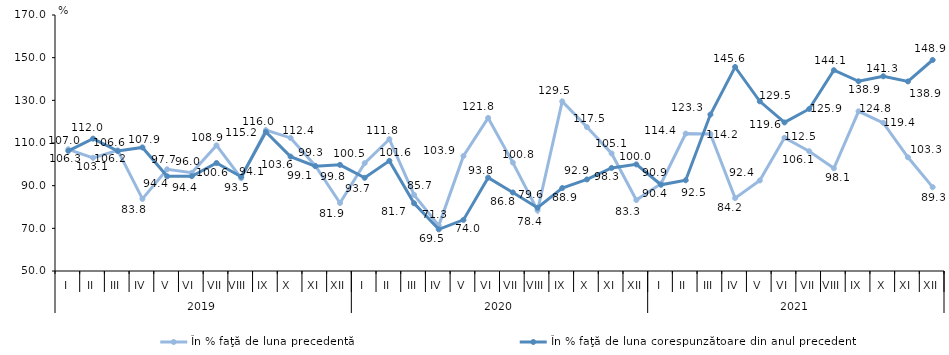
| Category | În % faţă de luna precedentă | În % faţă de luna corespunzătoare din anul precedent |
|---|---|---|
| 0 | 107.05 | 106.324 |
| 1 | 103.055 | 112.038 |
| 2 | 106.554 | 106.241 |
| 3 | 83.804 | 107.928 |
| 4 | 97.664 | 94.4 |
| 5 | 96.047 | 94.437 |
| 6 | 108.879 | 100.61 |
| 7 | 93.476 | 94.145 |
| 8 | 116.03 | 115.19 |
| 9 | 112.374 | 103.621 |
| 10 | 99.333 | 99.148 |
| 11 | 81.894 | 99.755 |
| 12 | 100.541 | 93.69 |
| 13 | 111.779 | 101.622 |
| 14 | 85.695 | 81.728 |
| 15 | 71.284 | 69.518 |
| 16 | 103.904 | 73.96 |
| 17 | 121.751 | 93.752 |
| 18 | 100.818 | 86.812 |
| 19 | 78.377 | 79.644 |
| 20 | 129.498 | 88.888 |
| 21 | 117.476 | 92.923 |
| 22 | 105.086 | 98.305 |
| 23 | 83.287 | 99.977 |
| 24 | 90.925 | 90.416 |
| 25 | 114.411 | 92.545 |
| 26 | 114.206 | 123.335 |
| 27 | 84.167 | 145.626 |
| 28 | 92.422 | 129.533 |
| 29 | 112.451 | 119.639 |
| 30 | 106.133 | 125.946 |
| 31 | 98.135 | 144.123 |
| 32 | 124.834 | 138.933 |
| 33 | 119.448 | 141.264 |
| 34 | 103.298 | 138.861 |
| 35 | 89.314 | 148.909 |